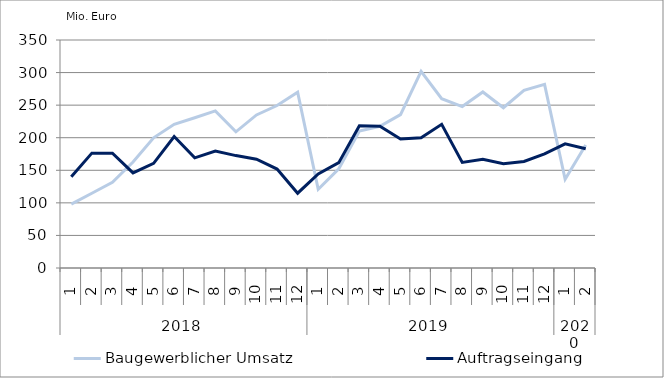
| Category | Baugewerblicher Umsatz | Auftragseingang |
|---|---|---|
| 0 | 97959.056 | 140119.385 |
| 1 | 114756.787 | 176330.213 |
| 2 | 131454.642 | 176241.061 |
| 3 | 162648.053 | 146063.407 |
| 4 | 199809.407 | 160551.931 |
| 5 | 220535.974 | 201835.846 |
| 6 | 230672.472 | 169132.23 |
| 7 | 241233.619 | 179396.293 |
| 8 | 209099.292 | 172542.764 |
| 9 | 234953.007 | 166991.729 |
| 10 | 249410.043 | 151835.629 |
| 11 | 269773.227 | 114807.456 |
| 12 | 120975.133 | 144510.881 |
| 13 | 152329.786 | 161685.201 |
| 14 | 210227.67 | 218455.879 |
| 15 | 217522.321 | 217610.064 |
| 16 | 235490.429 | 198110.439 |
| 17 | 301963.302 | 200012.086 |
| 18 | 259975.317 | 220559.061 |
| 19 | 247779.658 | 162059.723 |
| 20 | 270249.609 | 166829.611 |
| 21 | 245966.91 | 160120.773 |
| 22 | 272620.351 | 163589.389 |
| 23 | 281810.121 | 175051.247 |
| 24 | 136135.432 | 190647.086 |
| 25 | 188682.361 | 183141.14 |